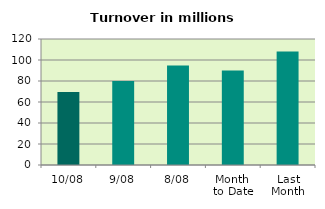
| Category | Series 0 |
|---|---|
| 10/08 | 69.439 |
| 9/08 | 79.914 |
| 8/08 | 94.766 |
| Month 
to Date | 89.974 |
| Last
Month | 108.022 |